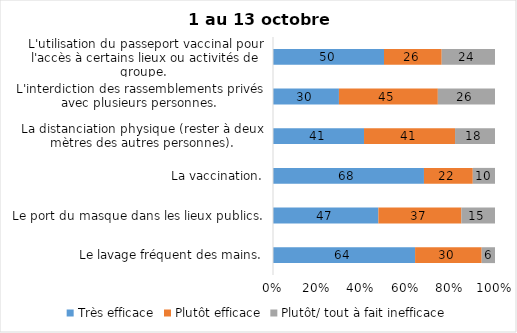
| Category | Très efficace | Plutôt efficace | Plutôt/ tout à fait inefficace |
|---|---|---|---|
| Le lavage fréquent des mains. | 64 | 30 | 6 |
| Le port du masque dans les lieux publics. | 47 | 37 | 15 |
| La vaccination. | 68 | 22 | 10 |
| La distanciation physique (rester à deux mètres des autres personnes). | 41 | 41 | 18 |
| L'interdiction des rassemblements privés avec plusieurs personnes. | 30 | 45 | 26 |
| L'utilisation du passeport vaccinal pour l'accès à certains lieux ou activités de groupe.  | 50 | 26 | 24 |